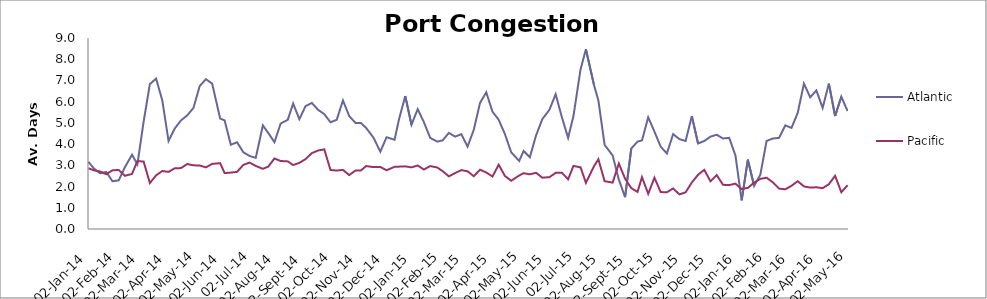
| Category | Atlantic  | Pacific |
|---|---|---|
| 2014-01-02 | 3.167 | 2.863 |
| 2014-01-08 | 2.854 | 2.767 |
| 2014-01-15 | 2.625 | 2.712 |
| 2014-01-22 | 2.688 | 2.582 |
| 2014-01-29 | 2.25 | 2.767 |
| 2014-02-05 | 2.292 | 2.781 |
| 2014-02-12 | 2.917 | 2.507 |
| 2014-02-20 | 3.5 | 2.596 |
| 2014-02-26 | 3.042 | 3.199 |
| 2014-03-05 | 5.059 | 3.178 |
| 2014-03-12 | 6.824 | 2.164 |
| 2014-03-19 | 7.088 | 2.527 |
| 2014-03-26 | 6.059 | 2.733 |
| 2014-04-02 | 4.147 | 2.692 |
| 2014-04-09 | 4.735 | 2.863 |
| 2014-04-16 | 5.118 | 2.87 |
| 2014-04-23 | 5.353 | 3.062 |
| 2014-04-30 | 5.706 | 3 |
| 2014-05-07 | 6.735 | 2.993 |
| 2014-05-14 | 7.059 | 2.904 |
| 2014-05-21 | 6.853 | 3.068 |
| 2014-05-30 | 5.206 | 3.103 |
| 2014-06-04 | 5.118 | 2.637 |
| 2014-06-11 | 3.971 | 2.658 |
| 2014-06-18 | 4.088 | 2.692 |
| 2014-06-25 | 3.618 | 3.021 |
| 2014-07-02 | 3.441 | 3.13 |
| 2014-07-09 | 3.353 | 2.973 |
| 2014-07-17 | 4.882 | 2.836 |
| 2014-07-23 | 4.529 | 2.938 |
| 2014-07-30 | 4.088 | 3.322 |
| 2014-08-06 | 4.971 | 3.205 |
| 2014-08-14 | 5.147 | 3.185 |
| 2014-08-20 | 5.912 | 3.014 |
| 2014-08-27 | 5.176 | 3.116 |
| 2014-09-03 | 5.794 | 3.295 |
| 2014-09-10 | 5.941 | 3.575 |
| 2014-09-17 | 5.618 | 3.699 |
| 2014-09-24 | 5.412 | 3.753 |
| 2014-10-01 | 5.029 | 2.781 |
| 2014-10-08 | 5.147 | 2.753 |
| 2014-10-15 | 6.059 | 2.785 |
| 2014-10-22 | 5.324 | 2.541 |
| 2014-10-29 | 5 | 2.753 |
| 2014-11-04 | 5 | 2.753 |
| 2014-11-10 | 4.765 | 2.966 |
| 2014-11-18 | 4.324 | 2.918 |
| 2014-11-26 | 3.647 | 2.925 |
| 2014-12-03 | 4.324 | 2.767 |
| 2014-12-12 | 4.206 | 2.932 |
| 2014-12-17 | 5.176 | 2.938 |
| 2014-12-24 | 6.265 | 2.952 |
| 2014-12-31 | 4.912 | 2.904 |
| 2015-01-07 | 5.647 | 2.993 |
| 2015-01-14 | 5.029 | 2.801 |
| 2015-01-21 | 4.294 | 2.966 |
| 2015-01-29 | 4.118 | 2.897 |
| 2015-02-04 | 4.176 | 2.726 |
| 2015-02-11 | 4.529 | 2.479 |
| 2015-02-18 | 4.353 | 2.637 |
| 2015-02-25 | 4.471 | 2.774 |
| 2015-03-04 | 3.882 | 2.719 |
| 2015-03-11 | 4.676 | 2.486 |
| 2015-03-18 | 5.941 | 2.795 |
| 2015-03-25 | 6.441 | 2.664 |
| 2015-04-01 | 5.529 | 2.473 |
| 2015-04-08 | 5.147 | 3.027 |
| 2015-04-15 | 4.471 | 2.5 |
| 2015-04-22 | 3.618 | 2.274 |
| 2015-05-01 | 3.206 | 2.521 |
| 2015-05-06 | 3.676 | 2.63 |
| 2015-05-13 | 3.382 | 2.575 |
| 2015-05-20 | 4.412 | 2.651 |
| 2015-05-27 | 5.176 | 2.418 |
| 2015-06-04 | 5.618 | 2.442 |
| 2015-06-11 | 6.353 | 2.645 |
| 2015-06-18 | 5.265 | 2.651 |
| 2015-06-25 | 4.294 | 2.342 |
| 2015-07-01 | 5.324 | 2.973 |
| 2015-07-09 | 7.529 | 2.904 |
| 2015-07-15 | 8.471 | 2.175 |
| 2015-07-24 | 6.794 | 2.952 |
| 2015-07-29 | 6.059 | 3.288 |
| 2015-08-05 | 3.971 | 2.253 |
| 2015-08-14 | 3.471 | 2.185 |
| 2015-08-21 | 2.324 | 3.089 |
| 2015-08-28 | 1.5 | 2.37 |
| 2015-09-04 | 3.794 | 1.925 |
| 2015-09-11 | 4.118 | 1.747 |
| 2015-09-16 | 4.176 | 2.445 |
| 2015-09-23 | 5.265 | 1.658 |
| 2015-09-30 | 4.588 | 2.418 |
| 2015-10-07 | 3.882 | 1.74 |
| 2015-10-14 | 3.559 | 1.733 |
| 2015-10-21 | 4.471 | 1.911 |
| 2015-10-28 | 4.235 | 1.63 |
| 2015-11-04 | 4.147 | 1.726 |
| 2015-11-11 | 5.324 | 2.192 |
| 2015-11-18 | 4.029 | 2.555 |
| 2015-11-25 | 4.147 | 2.788 |
| 2015-12-02 | 4.353 | 2.247 |
| 2015-12-09 | 4.441 | 2.541 |
| 2015-12-16 | 4.265 | 2.082 |
| 2015-12-23 | 4.294 | 2.068 |
| 2015-12-30 | 3.471 | 2.137 |
| 2016-01-06 | 1.353 | 1.884 |
| 2016-01-13 | 3.265 | 1.938 |
| 2016-01-20 | 2.029 | 2.185 |
| 2016-01-27 | 2.559 | 2.363 |
| 2016-02-03 | 4.147 | 2.418 |
| 2016-02-10 | 4.265 | 2.199 |
| 2016-02-17 | 4.294 | 1.904 |
| 2016-02-24 | 4.882 | 1.87 |
| 2016-03-02 | 4.765 | 2.034 |
| 2016-03-09 | 5.471 | 2.253 |
| 2016-03-16 | 6.853 | 2.007 |
| 2016-03-23 | 6.206 | 1.952 |
| 2016-03-30 | 6.529 | 1.966 |
| 2016-04-06 | 5.706 | 1.925 |
| 2016-04-13 | 6.853 | 2.11 |
| 2016-04-20 | 5.324 | 2.507 |
| 2016-04-27 | 6.235 | 1.733 |
| 2016-05-04 | 5.559 | 2.062 |